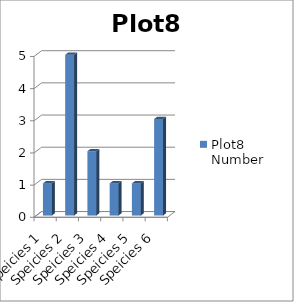
| Category | Plot8 Number |
|---|---|
| Speicies 1 | 1 |
| Speicies 2 | 5 |
| Speicies 3 | 2 |
| Speicies 4 | 1 |
| Speicies 5 | 1 |
| Speicies 6 | 3 |